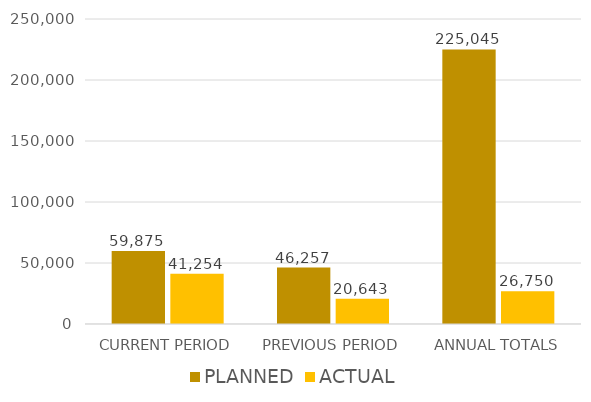
| Category | PLANNED | ACTUAL |
|---|---|---|
| CURRENT PERIOD | 59875 | 41254 |
| PREVIOUS PERIOD | 46257 | 20643 |
| ANNUAL TOTALS | 225045 | 26750 |